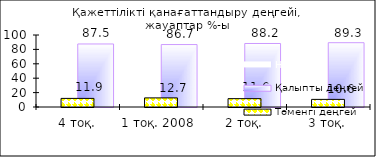
| Category | Не знаю | Қалыпты деңгей |
|---|---|---|
| 4 тоқ. | 0.52 | 87.54 |
| 1 тоқ. 2008  | 0.64 | 86.7 |
| 2 тоқ. | 0.18 | 88.21 |
| 3 тоқ. | 0.12 | 89.29 |